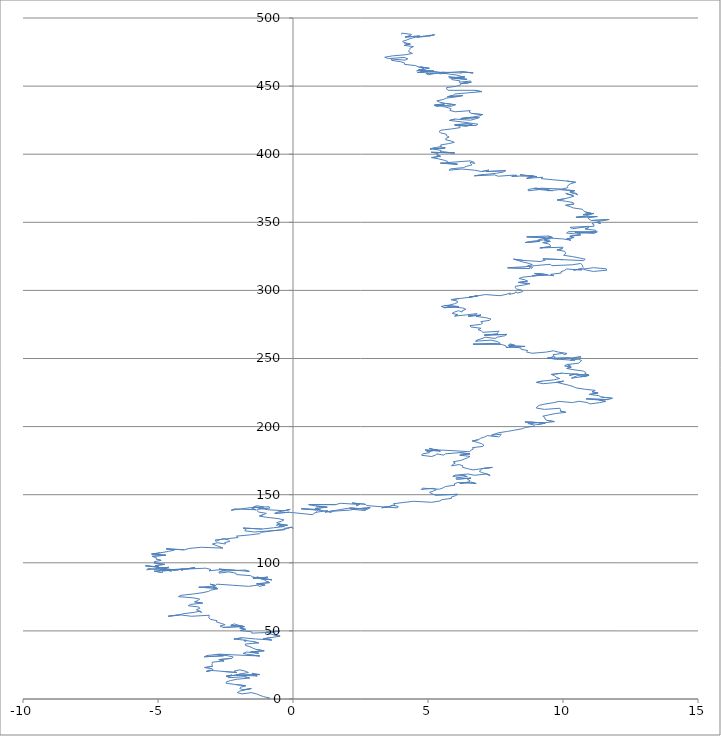
| Category | Series 0 |
|---|---|
| -0.967637781060734 | -0.252 |
| -0.8681276283056971 | 0.743 |
| -1.0902619198233328 | 1.718 |
| -1.2264924085918485 | 2.708 |
| -1.3473600593152166 | 3.701 |
| -1.5497652449910198 | 4.68 |
| -1.8994669642995285 | 3.743 |
| -2.060965084202895 | 4.73 |
| -1.9830156388350593 | 5.727 |
| -1.7699216082163005 | 6.704 |
| -1.5440706706449827 | 7.679 |
| -1.8534643194154705 | 6.728 |
| -1.9705013343506663 | 7.721 |
| -1.9344151107006875 | 8.72 |
| -1.7465046305377085 | 9.702 |
| -2.125306220456088 | 10.628 |
| -2.4767343352695814 | 11.564 |
| -2.4667831681349046 | 12.564 |
| -2.3119002075169885 | 13.552 |
| -2.0669611554461342 | 14.521 |
| -1.6074313308518822 | 15.41 |
| -1.803526829664302 | 16.39 |
| -2.3990119061906814 | 15.587 |
| -2.395415668733057 | 16.587 |
| -2.2658499823076665 | 17.578 |
| -2.4781146485122574 | 16.601 |
| -2.1141861763573453 | 17.533 |
| -1.327348443743011 | 16.915 |
| -1.474807599145027 | 17.904 |
| -1.5181748211542947 | 18.903 |
| -1.2252858698534137 | 17.947 |
| -2.11920646133378 | 17.499 |
| -1.9313442536639118 | 18.481 |
| -1.6511237109268446 | 19.441 |
| -1.7646680063527296 | 20.435 |
| -1.9675020839164146 | 21.414 |
| -2.1816453279782624 | 20.437 |
| -2.0820298885873454 | 19.442 |
| -2.614156130401052 | 20.289 |
| -3.1129581529803483 | 21.156 |
| -3.2170678142981455 | 20.161 |
| -2.966611918955998 | 21.129 |
| -2.9809335270448925 | 22.129 |
| -3.2725175224282737 | 23.086 |
| -2.978194680532655 | 24.041 |
| -3.006054828494452 | 25.041 |
| -2.9903857812221775 | 26.041 |
| -2.9890170950700443 | 27.041 |
| -2.5529374268231297 | 27.941 |
| -2.745625166175476 | 28.922 |
| -2.277347568823481 | 29.805 |
| -2.2139846569955384 | 30.803 |
| -2.4250391766588186 | 31.781 |
| -2.8088417978732845 | 32.704 |
| -2.5806140204547723 | 31.731 |
| -3.279016065775378 | 31.015 |
| -3.1430089747492085 | 32.006 |
| -2.7272128770990225 | 32.915 |
| -2.000024081604294 | 32.229 |
| -1.2324091960915242 | 31.588 |
| -1.6225082509289308 | 32.509 |
| -1.8490571753098033 | 33.483 |
| -1.724245783237169 | 34.475 |
| -1.2655910350635633 | 33.586 |
| -1.566383697685815 | 34.54 |
| -1.067563372398675 | 35.407 |
| -1.359393963863146 | 36.363 |
| -1.4876880300500224 | 37.355 |
| -1.592376315803578 | 38.349 |
| -1.7623045023741961 | 39.335 |
| -1.7687499358915508 | 40.335 |
| -1.272567995484619 | 41.203 |
| -1.4768354125586047 | 42.182 |
| -1.8188942571457145 | 43.122 |
| -1.7777775907386808 | 42.122 |
| -1.7199226407753898 | 43.121 |
| -2.1894053207510935 | 44.004 |
| -1.8708415171212671 | 44.952 |
| -1.3862193815363495 | 44.077 |
| -0.786714481148158 | 43.276 |
| -1.0959376892264792 | 44.227 |
| -0.7855679813940635 | 45.178 |
| -0.47747536179639166 | 46.129 |
| -0.7149093235800298 | 47.101 |
| -0.8782678456193744 | 48.087 |
| -0.9900089798342089 | 49.081 |
| -0.4798332738970893 | 49.941 |
| -0.7808780302407492 | 48.988 |
| -1.5262619752118525 | 48.321 |
| -1.5260937669947745 | 49.321 |
| -1.9526455622190224 | 50.225 |
| -1.7579751176466378 | 51.206 |
| -1.9702741041306848 | 52.184 |
| -1.802664345863649 | 53.169 |
| -2.021205092038885 | 54.145 |
| -2.1752201815329104 | 55.133 |
| -2.3049494726084014 | 54.142 |
| -1.859326781990406 | 53.247 |
| -2.5916672413710486 | 52.566 |
| -2.7049937722807345 | 53.559 |
| -2.5149698746193394 | 54.541 |
| -2.6589214724550647 | 55.53 |
| -2.8378723952541898 | 56.514 |
| -2.814345296892887 | 57.514 |
| -3.055812411191806 | 58.484 |
| -3.116107962332558 | 59.483 |
| -3.1076166711116326 | 60.483 |
| -3.1014529003173594 | 61.483 |
| -3.7640366470857027 | 60.734 |
| -4.133535726692253 | 61.663 |
| -4.619322717180363 | 60.789 |
| -4.254160372651663 | 61.72 |
| -4.031569484729305 | 62.695 |
| -3.652806411909602 | 63.62 |
| -3.43134764801232 | 64.595 |
| -3.3863098296623524 | 63.596 |
| -3.4786693268443414 | 64.592 |
| -3.580375548042828 | 65.587 |
| -3.4513866576915575 | 66.578 |
| -3.488073792925818 | 67.578 |
| -3.88159100777322 | 68.497 |
| -3.7894088909142356 | 69.493 |
| -3.3440418244978463 | 70.388 |
| -3.6437402314077283 | 71.342 |
| -3.5286885603012563 | 72.336 |
| -3.4571684820756317 | 73.333 |
| -3.703213846416732 | 74.302 |
| -4.243574507875341 | 75.144 |
| -4.145080736322742 | 76.139 |
| -3.711920144948575 | 77.04 |
| -3.3705694340256396 | 77.98 |
| -3.1388571455342964 | 78.953 |
| -3.0427957491567894 | 79.948 |
| -2.7856487799611807 | 80.915 |
| -2.963090141697716 | 81.899 |
| -2.923869015614021 | 82.898 |
| -3.488479405181014 | 82.073 |
| -2.8179402736064048 | 81.331 |
| -2.8964196167783545 | 82.328 |
| -2.926863540281497 | 83.327 |
| -3.0671068947046876 | 84.317 |
| -2.8586712872855182 | 83.339 |
| -2.8258840991558793 | 84.339 |
| -2.232758176032668 | 83.534 |
| -1.6461296260696372 | 82.724 |
| -1.290580792651117 | 83.658 |
| -1.2590654062727276 | 82.659 |
| -1.0331439639707025 | 83.633 |
| -1.346614752728831 | 84.583 |
| -0.8604992331916801 | 85.457 |
| -0.9901312189851774 | 86.448 |
| -1.0632615114972812 | 87.446 |
| -1.2147539767295632 | 88.434 |
| -0.7832517151441714 | 87.532 |
| -1.1598367585709144 | 88.458 |
| -0.9418175120764358 | 89.434 |
| -1.4798616190504852 | 88.591 |
| -1.2949999068128277 | 89.574 |
| -1.2209339290076504 | 88.577 |
| -1.4964525132296462 | 89.538 |
| -1.5663250461225342 | 90.536 |
| -2.0986833402792913 | 91.382 |
| -2.1132900216573463 | 92.382 |
| -2.390116994220458 | 93.343 |
| -2.735825481304285 | 92.405 |
| -2.735891859928269 | 93.405 |
| -2.4887609297764386 | 94.374 |
| -2.7344026093036486 | 95.343 |
| -2.140449477201469 | 94.538 |
| -1.6189062583828515 | 93.685 |
| -1.7775420542805698 | 94.673 |
| -2.515021168559592 | 93.997 |
| -2.6907938095449064 | 94.982 |
| -3.1110757522666845 | 94.074 |
| -3.0368562185075803 | 95.071 |
| -3.230593918327033 | 96.053 |
| -3.9733512538860762 | 95.383 |
| -3.6283064632120716 | 96.322 |
| -4.0449567099639125 | 95.412 |
| -4.4240905918249105 | 94.487 |
| -4.0708328756788985 | 95.423 |
| -4.128082233506804 | 94.424 |
| -4.0137970238752025 | 95.418 |
| -4.7831692291763055 | 94.779 |
| -5.140791749995198 | 93.845 |
| -4.837568377374931 | 92.892 |
| -4.830715295566635 | 93.892 |
| -4.404642912736567 | 94.797 |
| -4.787645455077601 | 95.721 |
| -4.607282629671975 | 96.704 |
| -5.037979704602732 | 95.802 |
| -5.420331147166783 | 94.878 |
| -5.358742611622519 | 95.876 |
| -5.016171854866894 | 94.936 |
| -4.491539617493978 | 94.085 |
| -4.9327663912319135 | 94.982 |
| -4.701228915726356 | 95.955 |
| -5.082970230489822 | 96.879 |
| -5.468320033773725 | 97.802 |
| -4.966946089826989 | 96.937 |
| -5.10650756662247 | 97.927 |
| -4.752943209397728 | 98.863 |
| -5.13314748838196 | 99.788 |
| -5.14267612984914 | 100.787 |
| -4.882527563794197 | 101.753 |
| -5.06271734918073 | 102.737 |
| -5.064355799961778 | 103.737 |
| -5.218149965969371 | 104.725 |
| -4.7100079849328145 | 105.586 |
| -5.235580996497048 | 106.437 |
| -4.9038370749374804 | 107.38 |
| -4.613693379219825 | 108.337 |
| -4.40249272585888 | 109.315 |
| -4.693200098047036 | 110.271 |
| -4.025665480660306 | 109.527 |
| -3.8594269782705357 | 110.513 |
| -3.393669837204222 | 111.398 |
| -2.5991305061316057 | 110.791 |
| -2.7229977149834665 | 111.783 |
| -2.848241609566811 | 112.775 |
| -2.9874647459233405 | 113.765 |
| -2.8043060161325215 | 114.748 |
| -2.5000045918273255 | 113.796 |
| -2.5322281357650356 | 114.795 |
| -2.3378189818083235 | 115.776 |
| -2.3896180109814606 | 116.775 |
| -2.584224221450221 | 117.756 |
| -2.7328316185599455 | 116.767 |
| -2.8588258973878493 | 115.775 |
| -2.876663382942638 | 116.775 |
| -2.4382619091618647 | 117.673 |
| -2.029778201993218 | 118.586 |
| -2.09541474627033 | 119.584 |
| -1.6106038611427034 | 120.459 |
| -1.2364874961243972 | 121.386 |
| -1.1729964651990628 | 122.384 |
| -0.8155156462653916 | 123.318 |
| -0.4522829716432174 | 124.25 |
| -0.19327813283605016 | 125.216 |
| -0.043800301194619 | 126.204 |
| -0.008704031003664833 | 125.205 |
| -0.04731843102836037 | 126.204 |
| -0.326657018622207 | 125.244 |
| -0.3133074987711384 | 124.244 |
| -0.8843363756040457 | 123.423 |
| -1.426267851012272 | 122.583 |
| -1.7891246943388321 | 123.515 |
| -1.7407283778984712 | 124.513 |
| -1.8451092234179975 | 125.508 |
| -1.1345864878206005 | 124.804 |
| -0.720698403316893 | 125.715 |
| -0.3232092702973862 | 126.632 |
| -0.501793724769893 | 127.616 |
| -0.5301312569323415 | 126.616 |
| -0.20066951723049653 | 127.561 |
| -0.5159552492488865 | 128.51 |
| -0.6130684823674918 | 127.514 |
| -0.503276396491102 | 128.508 |
| -0.6060430165198266 | 129.503 |
| -0.42917803641506513 | 130.487 |
| -0.33507244424469773 | 131.483 |
| -0.5508549169468402 | 132.459 |
| -0.9686026360269575 | 133.368 |
| -1.2459286827455178 | 134.329 |
| -1.1037387146283506 | 135.318 |
| -0.9884373305430953 | 136.312 |
| -1.2823518813746273 | 137.268 |
| -1.325155761785263 | 138.267 |
| -1.3171777722578015 | 139.267 |
| -0.8580893017813458 | 140.155 |
| -0.8830548225753558 | 141.155 |
| -1.5911537641877629 | 140.449 |
| -1.9435288046427714 | 139.513 |
| -2.285089014412914 | 138.573 |
| -2.1441638371229352 | 139.563 |
| -1.365712697035916 | 138.935 |
| -1.5204359957359974 | 139.923 |
| -1.47842415369416 | 140.922 |
| -1.3435145496938095 | 141.913 |
| -1.081409574982547 | 140.948 |
| -1.2101492006355865 | 139.956 |
| -1.38796707077773 | 140.941 |
| -1.181133246279407 | 139.962 |
| -0.9584399186842887 | 138.987 |
| -0.3047776278160683 | 138.23 |
| -0.10466818106966372 | 139.21 |
| -0.32329472543268545 | 138.234 |
| -0.5652120522816115 | 137.264 |
| -0.6763391103153511 | 136.27 |
| -0.1449865272834927 | 137.117 |
| 0.2923971378050174 | 136.218 |
| 0.7361290094459652 | 135.322 |
| 0.7674997867210377 | 136.322 |
| 0.9203656239563539 | 137.31 |
| 1.2777264083509159 | 138.244 |
| 1.1951586506055034 | 137.247 |
| 1.5046247590589195 | 138.198 |
| 1.77197318727614 | 139.162 |
| 2.072195230185861 | 140.116 |
| 2.726339056007461 | 139.359 |
| 2.6751130022881546 | 138.361 |
| 2.2002481237486275 | 139.241 |
| 2.1021273398252918 | 140.236 |
| 2.7674196250134515 | 139.489 |
| 2.860009001534042 | 140.485 |
| 2.346457317902526 | 139.627 |
| 2.091308366396242 | 138.66 |
| 1.4684722957604512 | 137.878 |
| 1.4052123857381045 | 136.88 |
| 1.237748438199661 | 137.865 |
| 0.9319763689789782 | 138.818 |
| 0.8849191832627876 | 137.819 |
| 0.8171161784377836 | 138.816 |
| 0.3048491927599096 | 139.675 |
| 1.008527693942899 | 138.965 |
| 0.8257709629629981 | 139.948 |
| 1.2664921569196608 | 140.845 |
| 0.8437117423727135 | 141.752 |
| 0.5816294725880599 | 142.717 |
| 1.5816294725880597 | 142.717 |
| 1.7556720267974246 | 143.701 |
| 2.3904188088758844 | 142.929 |
| 2.349822480529284 | 141.93 |
| 2.467266515488532 | 142.923 |
| 2.1947871168717086 | 143.885 |
| 2.6711531882497255 | 143.006 |
| 2.7347330356659985 | 142.008 |
| 3.262225213627909 | 141.158 |
| 3.8650398855676373 | 140.36 |
| 3.90061389518504 | 141.36 |
| 3.6635188261746316 | 142.331 |
| 3.6044377604317175 | 141.333 |
| 3.2883630277284426 | 140.384 |
| 3.5403905175288193 | 141.352 |
| 3.781182974610756 | 142.322 |
| 3.7155384599670995 | 143.32 |
| 4.072838907857863 | 144.254 |
| 4.473863060568639 | 145.17 |
| 5.128974390865939 | 144.415 |
| 5.4419858545717945 | 145.364 |
| 5.517457634712361 | 146.362 |
| 5.869547005784438 | 147.298 |
| 5.860718987032321 | 148.298 |
| 6.022593135553043 | 149.284 |
| 6.104601535257707 | 150.281 |
| 5.265211591632175 | 149.737 |
| 5.147338975089916 | 150.73 |
| 5.053934213908207 | 151.726 |
| 5.204024625001264 | 152.715 |
| 5.307561469300309 | 153.709 |
| 5.185924731076392 | 154.702 |
| 4.7501750239549185 | 153.802 |
| 4.792324390818551 | 154.801 |
| 5.422336627076318 | 154.024 |
| 5.556222065027766 | 155.015 |
| 5.642363637307726 | 156.012 |
| 5.9958672609386365 | 156.947 |
| 5.969047047926438 | 157.947 |
| 6.105315935931755 | 158.937 |
| 6.784996365207485 | 158.204 |
| 6.587610366472658 | 159.184 |
| 6.1790054147623685 | 158.272 |
| 6.491439955872147 | 159.221 |
| 6.560769395866443 | 160.219 |
| 6.464451945579719 | 161.214 |
| 6.595804361619346 | 162.206 |
| 6.055449412946225 | 161.364 |
| 6.035098530658965 | 162.364 |
| 6.450577421928387 | 163.274 |
| 6.29810938402052 | 164.262 |
| 5.919194600389626 | 163.337 |
| 6.00522313961359 | 164.333 |
| 6.477772887851289 | 165.214 |
| 6.7318566006701435 | 164.247 |
| 7.1428911430024 | 165.159 |
| 7.300232267884602 | 164.171 |
| 7.195047667595611 | 165.166 |
| 7.014529701338333 | 166.149 |
| 6.8996241717796645 | 167.142 |
| 6.959668429243688 | 168.141 |
| 6.990335472395328 | 169.14 |
| 7.3841417050025555 | 170.059 |
| 7.001062241524145 | 169.136 |
| 6.669266799741336 | 168.192 |
| 6.454838348081768 | 169.169 |
| 6.272283513472604 | 170.152 |
| 6.295130568750244 | 171.152 |
| 6.155576381378462 | 172.142 |
| 5.867947776096628 | 171.184 |
| 5.913891435933284 | 172.183 |
| 6.009685975514058 | 173.179 |
| 5.9328921592822415 | 174.176 |
| 6.219188955721336 | 175.134 |
| 6.33842598828396 | 176.127 |
| 6.467515032017868 | 177.119 |
| 6.553849053988128 | 178.115 |
| 6.175431147014669 | 179.04 |
| 6.557708154839755 | 179.964 |
| 6.187323196864632 | 180.893 |
| 5.648041251024268 | 180.051 |
| 5.585919537665707 | 179.053 |
| 5.323054317830582 | 180.018 |
| 5.282083232706628 | 179.019 |
| 5.129422781228116 | 178.031 |
| 4.765696967872385 | 178.962 |
| 4.801647205887851 | 179.961 |
| 5.05643391875366 | 180.928 |
| 4.949146928767914 | 181.923 |
| 5.348819427948249 | 182.839 |
| 5.0338895565289805 | 181.89 |
| 4.897492275542443 | 182.881 |
| 5.456063406777163 | 182.051 |
| 5.2876386604736165 | 183.037 |
| 5.049515219100018 | 184.008 |
| 5.198804396163651 | 183.02 |
| 5.927600577294621 | 182.335 |
| 6.547155236952519 | 181.55 |
| 6.57902384220031 | 182.549 |
| 6.683338359058461 | 183.544 |
| 6.645726447050258 | 184.543 |
| 7.034661228626674 | 185.464 |
| 7.065744903187973 | 186.464 |
| 6.98667186941533 | 187.461 |
| 6.825758244978115 | 188.448 |
| 6.640429516296138 | 189.43 |
| 6.873566045663776 | 190.403 |
| 6.945875449648632 | 191.4 |
| 7.104272110847606 | 192.388 |
| 7.194585012755034 | 193.384 |
| 7.616065142563201 | 192.477 |
| 7.684149946084984 | 193.474 |
| 7.709799916482276 | 194.474 |
| 7.3481298933774815 | 193.542 |
| 7.463164028607744 | 194.535 |
| 7.628985948941431 | 195.521 |
| 7.941836582261983 | 196.471 |
| 8.214446290876545 | 197.433 |
| 8.48685122005736 | 198.395 |
| 8.607881707953759 | 199.388 |
| 8.96174946628873 | 200.323 |
| 8.893234883989532 | 201.321 |
| 8.6995998455895 | 202.302 |
| 8.750009458962722 | 203.301 |
| 9.343222980818876 | 202.496 |
| 9.07165171771388 | 201.533 |
| 8.769739209325465 | 202.487 |
| 8.591000752702838 | 203.471 |
| 9.283955304518141 | 202.75 |
| 9.68043073138566 | 203.668 |
| 9.395665237370483 | 204.626 |
| 9.330876875884043 | 205.624 |
| 9.332081238662235 | 206.624 |
| 9.250128008956239 | 207.621 |
| 9.47289939593453 | 208.596 |
| 9.718410463775518 | 209.565 |
| 10.105450128656955 | 210.487 |
| 9.89541292495139 | 211.465 |
| 9.909273592358232 | 212.465 |
| 9.887396811236151 | 213.464 |
| 9.311700644216538 | 212.647 |
| 9.013188823350955 | 213.601 |
| 9.042117927696497 | 214.601 |
| 9.124182921295269 | 215.597 |
| 9.337294916652043 | 216.574 |
| 9.632251928973156 | 217.53 |
| 9.855180656190083 | 218.505 |
| 10.352156104008069 | 217.637 |
| 10.599188101896493 | 218.606 |
| 10.893726770284179 | 217.65 |
| 11.007656720738446 | 216.657 |
| 11.363056633847826 | 217.592 |
| 11.58271281107231 | 218.567 |
| 11.32397697620041 | 219.533 |
| 10.852928328654254 | 220.415 |
| 11.661015000479788 | 219.826 |
| 11.83057055169516 | 220.812 |
| 11.40826426696633 | 221.718 |
| 11.32798857616516 | 222.715 |
| 10.97533099099128 | 223.651 |
| 11.298709042071236 | 224.597 |
| 11.078538998137589 | 225.572 |
| 11.190471368346142 | 226.566 |
| 10.79281155793461 | 227.484 |
| 10.478040319277788 | 228.433 |
| 10.372307355168244 | 229.427 |
| 10.20912939182121 | 230.414 |
| 9.998689179890233 | 231.391 |
| 9.793555802695023 | 232.37 |
| 10.017107249469564 | 233.345 |
| 9.73079716623063 | 232.387 |
| 9.268130741395636 | 231.5 |
| 9.015127281072207 | 232.468 |
| 9.24675900422326 | 233.44 |
| 9.67542203594999 | 234.344 |
| 9.875601191537852 | 235.324 |
| 9.742964158430478 | 236.315 |
| 9.685653744253534 | 237.313 |
| 9.568673683031179 | 238.306 |
| 9.973992695297209 | 239.221 |
| 10.529398261813974 | 238.389 |
| 10.936684884778682 | 237.476 |
| 10.658899014993217 | 236.515 |
| 10.318294273679577 | 235.575 |
| 10.448352739816439 | 236.566 |
| 10.541669341948955 | 237.562 |
| 10.849254740776733 | 236.61 |
| 10.799551809170568 | 237.609 |
| 10.520537821961163 | 238.569 |
| 10.23731068995003 | 237.61 |
| 10.384216253302267 | 238.6 |
| 10.967158429115935 | 237.787 |
| 10.811094018553531 | 238.775 |
| 10.84121323962016 | 239.774 |
| 10.754501267489474 | 240.771 |
| 10.403936656819985 | 241.707 |
| 10.139201305655579 | 242.671 |
| 10.303581487669158 | 243.658 |
| 10.064232044725125 | 244.629 |
| 10.136898123226063 | 245.626 |
| 10.271595027713127 | 244.635 |
| 10.17601360356681 | 245.631 |
| 10.588807120609061 | 246.541 |
| 10.632775998932118 | 247.54 |
| 10.692794371451598 | 248.539 |
| 10.559538516070571 | 249.53 |
| 10.275932642617152 | 248.571 |
| 10.362052206085922 | 249.567 |
| 10.397495573239324 | 250.566 |
| 10.650398675308772 | 251.534 |
| 10.659853879718677 | 250.534 |
| 9.686370772627296 | 250.305 |
| 9.70774950690569 | 251.305 |
| 9.41866695400101 | 250.348 |
| 9.841369958966348 | 249.441 |
| 10.433994260791017 | 248.636 |
| 10.353525433946272 | 249.633 |
| 10.18109135247126 | 250.618 |
| 9.622218668843324 | 249.789 |
| 9.572320279853741 | 250.787 |
| 9.653682835116605 | 251.784 |
| 9.63102812845313 | 252.784 |
| 9.97141386450629 | 253.724 |
| 10.069648805260455 | 252.729 |
| 10.147236713007633 | 253.726 |
| 9.832532931329865 | 254.675 |
| 9.643405319519777 | 255.657 |
| 9.372761607323943 | 254.694 |
| 8.850241351711452 | 253.842 |
| 8.646613537539013 | 254.821 |
| 8.697614254505512 | 255.819 |
| 8.449045811075113 | 256.788 |
| 8.436556228488014 | 257.788 |
| 8.004530993270254 | 258.69 |
| 8.21657125121099 | 259.667 |
| 8.038705355016349 | 260.651 |
| 7.970179359466569 | 259.653 |
| 8.594926293025171 | 258.873 |
| 7.892898204015198 | 258.16 |
| 7.890613515270136 | 259.16 |
| 7.755683353490609 | 260.151 |
| 7.479076418556386 | 261.112 |
| 6.666495523566181 | 260.529 |
| 7.666495523566181 | 260.529 |
| 7.6575900378145825 | 261.529 |
| 7.556468805151612 | 262.524 |
| 7.336102949936535 | 263.5 |
| 6.762546806858359 | 262.681 |
| 6.848227587877519 | 263.677 |
| 6.997214031104146 | 264.666 |
| 7.129312107388239 | 265.657 |
| 7.484930766080468 | 264.722 |
| 7.577003075603793 | 265.718 |
| 7.8394510195507285 | 266.683 |
| 7.926190362107067 | 267.679 |
| 7.084170044842806 | 267.14 |
| 7.565612447433608 | 268.016 |
| 7.580298048583893 | 269.016 |
| 7.636115638099242 | 270.015 |
| 7.034133531112694 | 269.216 |
| 6.977016048679548 | 270.214 |
| 6.852082674890102 | 271.207 |
| 6.959710104911869 | 272.201 |
| 6.587440207539996 | 273.129 |
| 6.56244151187396 | 274.129 |
| 6.950567336286076 | 275.05 |
| 7.025741775890672 | 276.047 |
| 6.9538698068588936 | 277.045 |
| 7.2726391876295295 | 277.993 |
| 7.331468203608286 | 278.991 |
| 7.140767399802852 | 279.973 |
| 6.781957977658207 | 280.906 |
| 6.962677624940699 | 281.89 |
| 6.481995166306545 | 281.013 |
| 6.755312668277581 | 281.975 |
| 6.821631244707634 | 282.972 |
| 6.428830902782501 | 282.053 |
| 5.9893560615301 | 281.154 |
| 6.102966362821274 | 282.148 |
| 5.893243418956918 | 283.126 |
| 5.9847523293884946 | 284.122 |
| 6.131070639080713 | 285.111 |
| 6.262217473958137 | 284.119 |
| 6.269883485109139 | 285.119 |
| 6.408463337664277 | 286.11 |
| 6.287461932824729 | 287.102 |
| 5.810704217574557 | 287.981 |
| 5.616246073155945 | 288.962 |
| 6.140303993771439 | 288.111 |
| 5.597387810494674 | 287.271 |
| 5.488493206320046 | 288.265 |
| 5.788844148376631 | 289.219 |
| 5.985609312716392 | 290.199 |
| 6.090930314928399 | 291.194 |
| 6.080528125860045 | 292.194 |
| 5.860216111768378 | 293.169 |
| 6.179092148756626 | 294.117 |
| 6.596401298141954 | 295.026 |
| 6.831658695514024 | 295.998 |
| 6.5201318957439005 | 295.047 |
| 6.840155312759776 | 295.995 |
| 7.121434536782814 | 296.954 |
| 7.667468571895462 | 296.117 |
| 7.895071497011841 | 297.09 |
| 8.050605809950449 | 298.078 |
| 8.01597680597188 | 297.079 |
| 8.225022723460219 | 298.057 |
| 8.250274647978427 | 299.056 |
| 8.304665524220976 | 298.058 |
| 8.499954672452285 | 299.039 |
| 8.485629004674909 | 300.038 |
| 8.28454336179401 | 301.018 |
| 8.229463409548368 | 302.017 |
| 8.237484039723562 | 303.016 |
| 8.556771232534999 | 303.964 |
| 8.770497922719455 | 304.941 |
| 8.34751256696823 | 305.847 |
| 8.688272358035743 | 306.787 |
| 8.583766048223541 | 307.782 |
| 8.368821410682871 | 308.758 |
| 8.515305419649726 | 309.748 |
| 8.952341825349158 | 310.647 |
| 9.390220732201167 | 311.546 |
| 8.949247300929862 | 312.444 |
| 9.42749257817797 | 311.565 |
| 8.865148611098876 | 310.739 |
| 9.175720919309692 | 311.689 |
| 9.652224366418574 | 310.81 |
| 9.54903597493433 | 311.805 |
| 9.931998612632423 | 312.728 |
| 9.927059525984614 | 313.728 |
| 10.061525464184857 | 314.719 |
| 10.129761444082723 | 315.717 |
| 10.696040698169295 | 314.893 |
| 10.703621225140127 | 315.893 |
| 10.39009019233439 | 314.943 |
| 10.70353178281321 | 315.893 |
| 10.865626769063446 | 314.906 |
| 11.12496077088769 | 313.94 |
| 11.616893884585622 | 314.811 |
| 11.603194304152582 | 315.811 |
| 11.134947588845511 | 316.694 |
| 10.793721202616732 | 315.754 |
| 10.744665454968844 | 316.753 |
| 10.729822879603836 | 317.753 |
| 10.712999203937747 | 318.753 |
| 10.65550016605931 | 319.751 |
| 10.34565985533286 | 318.8 |
| 9.587566215052885 | 318.148 |
| 9.526938632659757 | 319.146 |
| 9.015314119851904 | 318.287 |
| 8.595635611210918 | 317.38 |
| 7.947635545743271 | 316.618 |
| 8.757022846055019 | 316.031 |
| 8.76978439680306 | 317.031 |
| 8.812856858506024 | 316.031 |
| 8.873805008804846 | 317.03 |
| 8.68441808850143 | 318.012 |
| 8.863513307924851 | 318.995 |
| 8.706268091682306 | 319.983 |
| 8.49678218981231 | 320.961 |
| 8.332964684897155 | 321.947 |
| 8.169454606682233 | 322.934 |
| 8.537091384323775 | 322.004 |
| 9.15427615225253 | 321.217 |
| 9.34234236780523 | 322.199 |
| 9.254980212856484 | 323.195 |
| 10.014378514715501 | 322.545 |
| 10.75828785837991 | 321.876 |
| 10.8235750332727 | 322.874 |
| 10.597303823632624 | 323.848 |
| 10.353844104694216 | 324.818 |
| 10.0234049723565 | 325.762 |
| 10.094336179731023 | 326.76 |
| 10.088732315732024 | 327.76 |
| 10.059287729155681 | 328.759 |
| 9.774467304761266 | 329.718 |
| 9.977491743906699 | 330.697 |
| 10.000542042437367 | 331.697 |
| 9.142477756996252 | 331.183 |
| 9.530417120767108 | 332.105 |
| 9.534168194118433 | 333.105 |
| 9.46647220177274 | 334.102 |
| 9.251702523597377 | 335.079 |
| 9.525681294462723 | 336.041 |
| 9.308213348057983 | 337.017 |
| 9.443100046426096 | 338.008 |
| 9.463229797403313 | 339.008 |
| 9.532636041669539 | 338.01 |
| 9.271640910526315 | 337.045 |
| 8.87690206462668 | 336.126 |
| 8.60276765192887 | 335.164 |
| 9.135306868630225 | 336.011 |
| 9.07449578178566 | 337.009 |
| 9.257933565753294 | 337.992 |
| 9.610219380555524 | 338.928 |
| 9.45519521249432 | 339.916 |
| 8.654446850811444 | 339.317 |
| 9.357415878254452 | 338.605 |
| 9.977064984509612 | 337.82 |
| 10.287747012468898 | 336.87 |
| 10.139472479229806 | 337.859 |
| 10.397553827078195 | 338.825 |
| 10.254603796309675 | 339.815 |
| 10.656505835286016 | 340.73 |
| 10.574239615439707 | 341.727 |
| 10.440871636440486 | 342.718 |
| 11.161804604786695 | 342.025 |
| 11.2690050071532 | 343.019 |
| 10.676220450595764 | 342.214 |
| 10.558645263042173 | 341.221 |
| 10.132227078001696 | 342.125 |
| 10.199477503464287 | 343.123 |
| 11.199477503464287 | 343.123 |
| 11.217174355639695 | 344.123 |
| 10.81847077846267 | 345.04 |
| 10.943003363770963 | 346.032 |
| 10.952253294524848 | 347.032 |
| 10.262202583912446 | 346.308 |
| 10.34644276194637 | 345.312 |
| 10.703217367821726 | 346.246 |
| 11.150288364280831 | 347.141 |
| 11.145797811200632 | 348.141 |
| 11.073388324109242 | 349.138 |
| 11.221488015418323 | 350.127 |
| 11.389573672531629 | 349.141 |
| 11.25565031540956 | 350.132 |
| 11.437218513724575 | 351.116 |
| 11.708928679542375 | 352.078 |
| 11.051979880344756 | 351.324 |
| 10.964632337755507 | 352.32 |
| 10.913214122737749 | 353.319 |
| 11.270423892687463 | 354.253 |
| 10.480269425419127 | 353.64 |
| 10.819372415821894 | 354.581 |
| 10.990573648631607 | 355.566 |
| 11.146224403449128 | 356.554 |
| 10.750313235191673 | 355.636 |
| 11.044058446092551 | 356.591 |
| 10.831307590193454 | 357.569 |
| 10.753142061885594 | 358.566 |
| 10.718975186217207 | 359.565 |
| 10.390603283584683 | 360.509 |
| 10.265916996658039 | 361.502 |
| 10.099332007007218 | 362.488 |
| 10.405217097821991 | 363.44 |
| 10.378374269387013 | 364.439 |
| 10.12142794858698 | 365.406 |
| 9.780334452468148 | 366.346 |
| 10.060445557757742 | 367.306 |
| 10.260255800067387 | 368.286 |
| 10.407294585032508 | 369.275 |
| 10.247712403906219 | 370.262 |
| 10.10294952951054 | 371.251 |
| 10.254264991779603 | 370.263 |
| 10.415916631062869 | 371.25 |
| 10.538306333105611 | 370.257 |
| 10.486501484604798 | 371.256 |
| 10.25123273770802 | 372.228 |
| 10.433236735334432 | 373.211 |
| 9.895741203123698 | 374.054 |
| 9.455083431690968 | 373.157 |
| 9.395641542366738 | 374.155 |
| 9.02260633751685 | 375.083 |
| 8.704108825939757 | 374.135 |
| 8.718630351188525 | 373.135 |
| 9.11028180197088 | 374.055 |
| 9.607349685268652 | 373.187 |
| 9.336256524019454 | 374.15 |
| 8.939505463750876 | 375.068 |
| 9.005704530044705 | 374.07 |
| 9.187086805151402 | 375.054 |
| 9.961690090517056 | 374.421 |
| 10.170287637404359 | 375.399 |
| 10.169616518599428 | 376.399 |
| 10.201623363031713 | 377.399 |
| 10.286477837447551 | 378.395 |
| 10.467002574115064 | 379.379 |
| 10.140316996887034 | 380.324 |
| 9.645501942857761 | 381.193 |
| 9.184113091142885 | 382.08 |
| 9.253230084571252 | 383.077 |
| 8.654757919643338 | 382.276 |
| 8.890939182035966 | 383.248 |
| 8.704836735411927 | 384.231 |
| 8.425095029994095 | 385.191 |
| 8.427735241312583 | 384.191 |
| 9.037211463666042 | 383.398 |
| 8.809004983045208 | 384.371 |
| 8.10400425917164 | 383.662 |
| 8.264339337339594 | 384.649 |
| 8.30281578401974 | 383.65 |
| 8.172608025406161 | 384.642 |
| 7.601962949702699 | 383.82 |
| 7.46209047186343 | 384.81 |
| 6.721117830624115 | 384.139 |
| 7.08809299015648 | 385.069 |
| 7.530839536356933 | 385.966 |
| 7.789931610445513 | 386.932 |
| 7.878174207846949 | 387.928 |
| 7.147303726401596 | 387.245 |
| 7.244410729397104 | 388.241 |
| 6.979833693405159 | 387.276 |
| 6.73028526458226 | 388.245 |
| 6.250828628872242 | 389.122 |
| 5.7761701631143625 | 388.242 |
| 5.842065350089798 | 389.24 |
| 6.307983280356476 | 390.125 |
| 6.429441934085568 | 391.117 |
| 6.623070282980563 | 392.098 |
| 6.578112777014454 | 393.097 |
| 6.55779641914443 | 394.097 |
| 6.730279394349381 | 393.112 |
| 6.705198865397091 | 394.112 |
| 6.5595443658718375 | 395.101 |
| 5.9997638653764085 | 394.272 |
| 5.459975662940174 | 393.431 |
| 6.088784550982228 | 392.653 |
| 5.746396044107262 | 393.593 |
| 5.7383238787917765 | 394.593 |
| 5.5966471964803794 | 395.582 |
| 5.3964629864353135 | 396.562 |
| 5.131346143651633 | 397.526 |
| 5.461394973464534 | 398.47 |
| 5.324895933871981 | 399.461 |
| 5.377919846513987 | 400.46 |
| 5.121327525425085 | 401.426 |
| 5.983382088806649 | 400.919 |
| 5.463122666573856 | 401.773 |
| 5.485760665925195 | 402.773 |
| 5.209479068728484 | 403.734 |
| 5.638040084076348 | 404.638 |
| 5.075805015481661 | 403.811 |
| 5.264854594656134 | 404.793 |
| 5.510529063745258 | 405.762 |
| 5.4620850104461365 | 406.761 |
| 5.749695368779668 | 407.719 |
| 5.9746349407629715 | 408.693 |
| 5.86028342826975 | 409.686 |
| 5.65115229341075 | 410.664 |
| 5.6676635130153725 | 411.664 |
| 5.782531034537331 | 412.658 |
| 5.678794825265004 | 413.652 |
| 5.681402506447661 | 414.652 |
| 5.469943613786699 | 415.63 |
| 5.4072945997170745 | 416.628 |
| 5.483687107833596 | 417.625 |
| 5.866438495414808 | 418.549 |
| 6.188570177742236 | 419.495 |
| 6.182013853481194 | 420.495 |
| 5.981049237837942 | 421.475 |
| 6.440782840515722 | 420.587 |
| 6.6392173645539465 | 421.567 |
| 6.464215607368586 | 422.551 |
| 6.006129417748852 | 421.663 |
| 6.761532859494079 | 421.007 |
| 6.852180347584516 | 422.003 |
| 6.5191496164110205 | 422.946 |
| 6.186332836858747 | 423.889 |
| 5.7952092762660525 | 424.809 |
| 6.0051504894463426 | 425.787 |
| 6.573008873011838 | 424.964 |
| 6.756481541359159 | 425.947 |
| 6.900713594490409 | 426.937 |
| 6.217291519112612 | 426.207 |
| 6.605585423565907 | 427.128 |
| 6.891509557920888 | 428.086 |
| 7.026172186582444 | 429.077 |
| 6.6033545538042056 | 429.983 |
| 6.52089278952342 | 430.98 |
| 6.568931974645498 | 431.979 |
| 6.0057607617877835 | 431.153 |
| 5.80484389349708 | 432.132 |
| 5.861056489284184 | 433.131 |
| 5.750058520047379 | 434.124 |
| 5.532954161565691 | 435.101 |
| 5.221071448427119 | 436.051 |
| 5.350876411403738 | 435.059 |
| 5.511316014361464 | 436.046 |
| 5.622271771272152 | 437.04 |
| 5.26935929463089 | 436.104 |
| 5.86424015903791 | 435.3 |
| 6.01791589410022 | 436.289 |
| 5.66485097126362 | 437.224 |
| 5.435300590742417 | 438.198 |
| 5.326809191539597 | 439.192 |
| 5.569464682136596 | 440.162 |
| 5.663682037139886 | 441.157 |
| 6.037194391906193 | 442.085 |
| 6.295630863375097 | 443.051 |
| 5.723735210375793 | 442.231 |
| 5.9409284014238475 | 443.207 |
| 5.98867159495658 | 444.206 |
| 6.487553284998416 | 445.072 |
| 6.993063341682397 | 445.935 |
| 6.7434388770543 | 446.903 |
| 5.7434388770543 | 446.903 |
| 5.694882098104472 | 447.902 |
| 5.685970195031147 | 448.902 |
| 6.0493068537564225 | 449.834 |
| 6.201640917533692 | 450.822 |
| 6.195616887961257 | 451.822 |
| 6.544869049739596 | 452.759 |
| 6.229890756123541 | 451.81 |
| 6.599867849855411 | 452.739 |
| 6.579408588152523 | 453.739 |
| 6.153257848637055 | 452.834 |
| 6.186992594912271 | 453.834 |
| 5.883159532705308 | 454.786 |
| 5.861939990881605 | 455.786 |
| 6.447169500069432 | 454.975 |
| 6.020774535192634 | 455.88 |
| 6.367223143239567 | 456.818 |
| 5.80026010551539 | 455.994 |
| 5.763593906965213 | 456.994 |
| 6.155031782180984 | 456.073 |
| 6.241819006708837 | 457.07 |
| 6.0717743305017144 | 458.055 |
| 5.730689141310957 | 458.995 |
| 5.400880970178036 | 459.939 |
| 5.436218767470998 | 458.94 |
| 5.748474642712182 | 459.89 |
| 4.921328928023579 | 459.328 |
| 5.009328826507029 | 458.332 |
| 5.269185550314374 | 459.297 |
| 5.522470860517262 | 460.265 |
| 6.259659851826979 | 459.589 |
| 6.2577657535671545 | 460.589 |
| 6.673571034546788 | 459.679 |
| 6.169433335794874 | 460.543 |
| 5.540929111026066 | 459.765 |
| 5.26623434397206 | 460.727 |
| 4.611594793825759 | 459.971 |
| 4.945070576126252 | 460.914 |
| 4.656796966702403 | 461.871 |
| 5.217507926955773 | 461.043 |
| 4.7126113470101165 | 460.18 |
| 4.962415981281782 | 461.148 |
| 4.852479501999768 | 462.142 |
| 4.582940454078531 | 461.179 |
| 4.750928980687538 | 462.165 |
| 5.048269374553875 | 463.12 |
| 4.726873535727978 | 464.067 |
| 4.848493294600094 | 463.074 |
| 4.65250555472187 | 464.055 |
| 4.537312330134582 | 465.048 |
| 4.127993294302102 | 465.961 |
| 4.133187038309229 | 466.961 |
| 3.9763647543895555 | 467.948 |
| 3.6533826734945363 | 468.895 |
| 3.636384523914893 | 469.894 |
| 4.153831687415653 | 469.039 |
| 4.2529719755598245 | 470.034 |
| 4.113248848674026 | 471.024 |
| 3.5310729990263097 | 470.211 |
| 3.396758354523439 | 471.202 |
| 3.674227527907719 | 472.163 |
| 4.170752455591273 | 473.031 |
| 4.423909359452814 | 473.998 |
| 4.300603854888644 | 474.99 |
| 4.286566256134544 | 475.99 |
| 4.326268418829815 | 476.989 |
| 4.338057477183092 | 477.989 |
| 4.460927353937057 | 478.982 |
| 4.124856375317553 | 479.924 |
| 4.3433645615835825 | 480.9 |
| 4.108227066755657 | 481.871 |
| 4.058251174725205 | 482.87 |
| 4.215770026798537 | 483.858 |
| 4.3372264710172965 | 484.85 |
| 4.525394259892013 | 485.832 |
| 4.869215469289224 | 486.772 |
| 5.243528450560618 | 487.699 |
| 5.0408808586308 | 486.72 |
| 4.5993322626720285 | 485.822 |
| 4.687702167665845 | 486.818 |
| 4.148148408771761 | 485.976 |
| 4.333671518187548 | 486.959 |
| 4.392429334637226 | 487.957 |
| 4.030160156238969 | 488.889 |
| 4.020889663652958 | 487.889 |